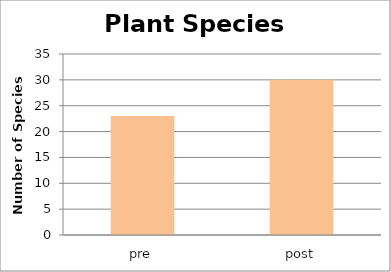
| Category | Series 0 |
|---|---|
| pre | 23 |
| post | 30 |